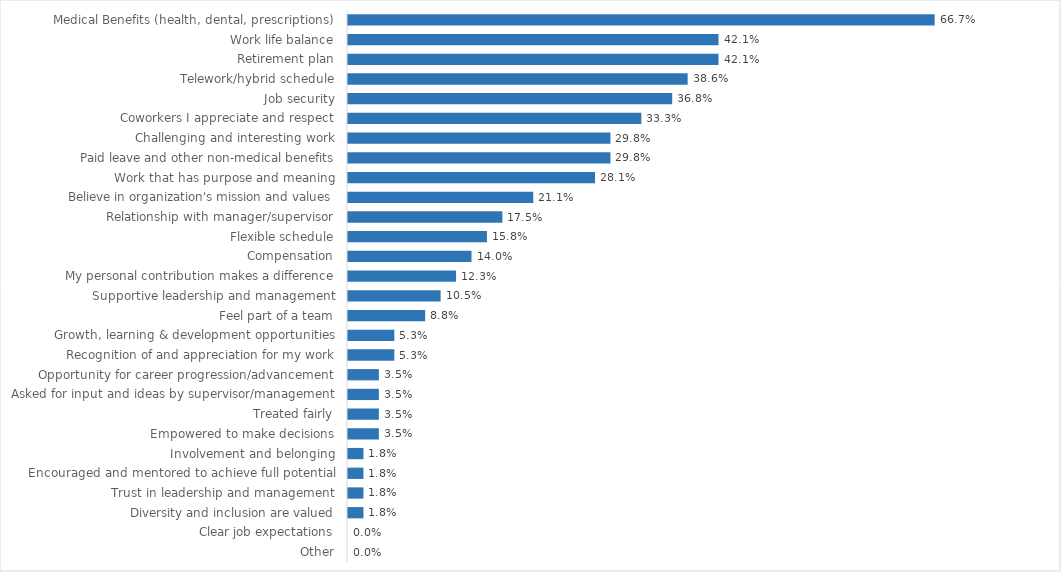
| Category | Series 0 |
|---|---|
| Medical Benefits (health, dental, prescriptions) | 0.667 |
| Work life balance | 0.421 |
| Retirement plan | 0.421 |
| Telework/hybrid schedule | 0.386 |
| Job security | 0.368 |
| Coworkers I appreciate and respect | 0.333 |
| Challenging and interesting work | 0.298 |
| Paid leave and other non-medical benefits | 0.298 |
| Work that has purpose and meaning | 0.281 |
| Believe in organization's mission and values | 0.211 |
| Relationship with manager/supervisor | 0.175 |
| Flexible schedule | 0.158 |
| Compensation | 0.14 |
| My personal contribution makes a difference | 0.123 |
| Supportive leadership and management | 0.105 |
| Feel part of a team | 0.088 |
| Growth, learning & development opportunities | 0.053 |
| Recognition of and appreciation for my work | 0.053 |
| Opportunity for career progression/advancement | 0.035 |
| Asked for input and ideas by supervisor/management | 0.035 |
| Treated fairly | 0.035 |
| Empowered to make decisions | 0.035 |
| Involvement and belonging | 0.018 |
| Encouraged and mentored to achieve full potential | 0.018 |
| Trust in leadership and management | 0.018 |
| Diversity and inclusion are valued | 0.018 |
| Clear job expectations | 0 |
| Other | 0 |